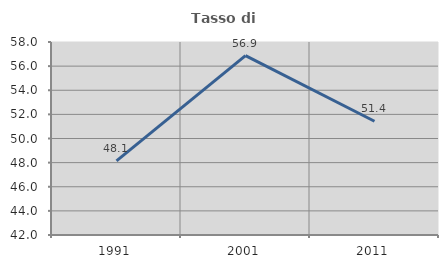
| Category | Tasso di occupazione   |
|---|---|
| 1991.0 | 48.148 |
| 2001.0 | 56.875 |
| 2011.0 | 51.429 |